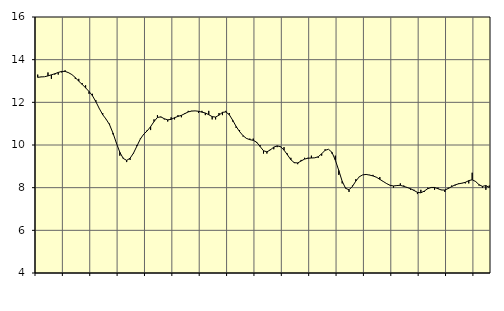
| Category | Piggar | Tillverkning av verkstadsvaror, SNI 25-30, 33 |
|---|---|---|
| nan | 13.3 | 13.17 |
| 87.0 | 13.2 | 13.19 |
| 87.0 | 13.2 | 13.2 |
| 87.0 | 13.4 | 13.24 |
| nan | 13.1 | 13.29 |
| 88.0 | 13.3 | 13.34 |
| 88.0 | 13.3 | 13.4 |
| 88.0 | 13.4 | 13.45 |
| nan | 13.5 | 13.45 |
| 89.0 | 13.4 | 13.39 |
| 89.0 | 13.3 | 13.3 |
| 89.0 | 13.1 | 13.16 |
| nan | 13.1 | 12.99 |
| 90.0 | 12.9 | 12.84 |
| 90.0 | 12.8 | 12.68 |
| 90.0 | 12.4 | 12.51 |
| nan | 12.4 | 12.31 |
| 91.0 | 12.1 | 12.03 |
| 91.0 | 11.7 | 11.71 |
| 91.0 | 11.5 | 11.42 |
| nan | 11.2 | 11.21 |
| 92.0 | 11 | 10.95 |
| 92.0 | 10.5 | 10.56 |
| 92.0 | 10.1 | 10.09 |
| nan | 9.5 | 9.66 |
| 93.0 | 9.4 | 9.37 |
| 93.0 | 9.2 | 9.28 |
| 93.0 | 9.3 | 9.38 |
| nan | 9.6 | 9.62 |
| 94.0 | 10 | 9.95 |
| 94.0 | 10.3 | 10.28 |
| 94.0 | 10.5 | 10.51 |
| nan | 10.7 | 10.66 |
| 95.0 | 10.7 | 10.86 |
| 95.0 | 11.2 | 11.1 |
| 95.0 | 11.4 | 11.29 |
| nan | 11.3 | 11.32 |
| 96.0 | 11.2 | 11.23 |
| 96.0 | 11.1 | 11.18 |
| 96.0 | 11.3 | 11.2 |
| nan | 11.2 | 11.28 |
| 97.0 | 11.4 | 11.34 |
| 97.0 | 11.3 | 11.39 |
| 97.0 | 11.5 | 11.47 |
| nan | 11.6 | 11.55 |
| 98.0 | 11.6 | 11.59 |
| 98.0 | 11.6 | 11.6 |
| 98.0 | 11.5 | 11.58 |
| nan | 11.6 | 11.54 |
| 99.0 | 11.4 | 11.5 |
| 99.0 | 11.6 | 11.42 |
| 99.0 | 11.2 | 11.33 |
| nan | 11.2 | 11.31 |
| 0.0 | 11.5 | 11.4 |
| 0.0 | 11.4 | 11.53 |
| 0.0 | 11.6 | 11.55 |
| nan | 11.5 | 11.42 |
| 1.0 | 11.1 | 11.16 |
| 1.0 | 10.8 | 10.87 |
| 1.0 | 10.7 | 10.63 |
| nan | 10.4 | 10.44 |
| 2.0 | 10.3 | 10.31 |
| 2.0 | 10.3 | 10.25 |
| 2.0 | 10.3 | 10.22 |
| nan | 10.1 | 10.13 |
| 3.0 | 10 | 9.93 |
| 3.0 | 9.6 | 9.73 |
| 3.0 | 9.6 | 9.68 |
| nan | 9.8 | 9.77 |
| 4.0 | 9.8 | 9.9 |
| 4.0 | 9.9 | 9.96 |
| 4.0 | 9.9 | 9.92 |
| nan | 9.9 | 9.76 |
| 5.0 | 9.6 | 9.54 |
| 5.0 | 9.4 | 9.31 |
| 5.0 | 9.2 | 9.17 |
| nan | 9.1 | 9.16 |
| 6.0 | 9.3 | 9.25 |
| 6.0 | 9.4 | 9.34 |
| 6.0 | 9.4 | 9.38 |
| nan | 9.5 | 9.39 |
| 7.0 | 9.4 | 9.4 |
| 7.0 | 9.4 | 9.45 |
| 7.0 | 9.5 | 9.59 |
| nan | 9.8 | 9.75 |
| 8.0 | 9.8 | 9.8 |
| 8.0 | 9.6 | 9.66 |
| 8.0 | 9.5 | 9.29 |
| nan | 8.6 | 8.81 |
| 9.0 | 8.2 | 8.3 |
| 9.0 | 8 | 7.97 |
| 9.0 | 7.8 | 7.9 |
| nan | 8.1 | 8.06 |
| 10.0 | 8.4 | 8.31 |
| 10.0 | 8.5 | 8.51 |
| 10.0 | 8.6 | 8.6 |
| nan | 8.6 | 8.62 |
| 11.0 | 8.6 | 8.59 |
| 11.0 | 8.6 | 8.55 |
| 11.0 | 8.5 | 8.49 |
| nan | 8.5 | 8.39 |
| 12.0 | 8.3 | 8.29 |
| 12.0 | 8.2 | 8.19 |
| 12.0 | 8.1 | 8.11 |
| nan | 8 | 8.08 |
| 13.0 | 8.1 | 8.1 |
| 13.0 | 8.2 | 8.11 |
| 13.0 | 8.1 | 8.06 |
| nan | 8 | 8.01 |
| 14.0 | 7.9 | 7.95 |
| 14.0 | 7.9 | 7.87 |
| 14.0 | 7.7 | 7.78 |
| nan | 7.9 | 7.76 |
| 15.0 | 7.8 | 7.84 |
| 15.0 | 8 | 7.95 |
| 15.0 | 8 | 8.01 |
| nan | 7.9 | 8.01 |
| 16.0 | 8 | 7.95 |
| 16.0 | 7.9 | 7.89 |
| 16.0 | 7.8 | 7.89 |
| nan | 8 | 7.96 |
| 17.0 | 8.1 | 8.05 |
| 17.0 | 8.1 | 8.13 |
| 17.0 | 8.2 | 8.18 |
| nan | 8.2 | 8.21 |
| 18.0 | 8.2 | 8.25 |
| 18.0 | 8.2 | 8.33 |
| 18.0 | 8.7 | 8.37 |
| nan | 8.3 | 8.29 |
| 19.0 | 8.1 | 8.14 |
| 19.0 | 8 | 8.06 |
| 19.0 | 7.9 | 8.1 |
| nan | 8.1 | 8.01 |